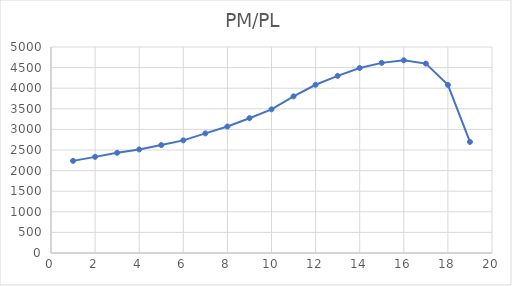
| Category | Series 0 |
|---|---|
| 0 | 2236 |
| 1 | 2333 |
| 2 | 2432 |
| 3 | 2513 |
| 4 | 2619 |
| 5 | 2734 |
| 6 | 2903 |
| 7 | 3070 |
| 8 | 3272 |
| 9 | 3487 |
| 10 | 3802 |
| 11 | 4083 |
| 12 | 4300 |
| 13 | 4490 |
| 14 | 4615 |
| 15 | 4678 |
| 16 | 4597 |
| 17 | 4080 |
| 18 | 2696 |